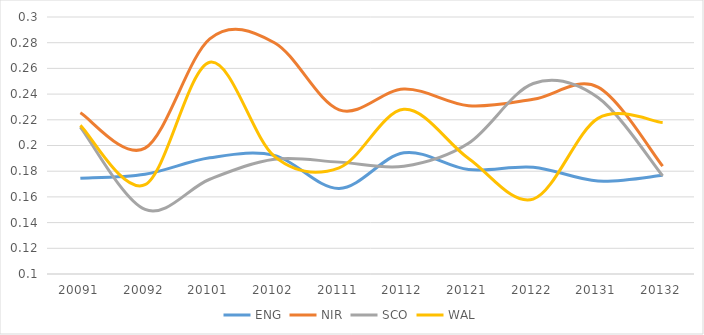
| Category | ENG | NIR | SCO | WAL |
|---|---|---|---|---|
| 20091.0 | 0.175 | 0.225 | 0.214 | 0.216 |
| 20092.0 | 0.178 | 0.198 | 0.15 | 0.17 |
| 20101.0 | 0.19 | 0.283 | 0.174 | 0.265 |
| 20102.0 | 0.192 | 0.28 | 0.189 | 0.191 |
| 20111.0 | 0.167 | 0.228 | 0.187 | 0.183 |
| 20112.0 | 0.194 | 0.244 | 0.184 | 0.228 |
| 20121.0 | 0.181 | 0.231 | 0.202 | 0.19 |
| 20122.0 | 0.183 | 0.236 | 0.248 | 0.158 |
| 20131.0 | 0.172 | 0.245 | 0.237 | 0.221 |
| 20132.0 | 0.177 | 0.184 | 0.176 | 0.218 |